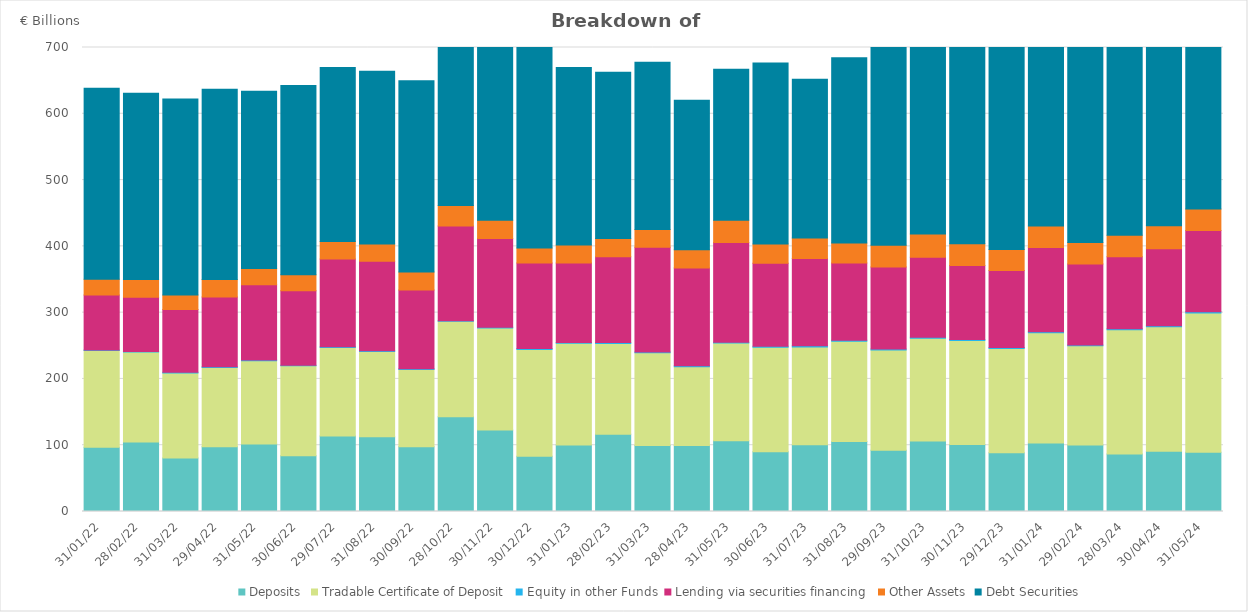
| Category | Deposits | Tradable Certificate of Deposit | Equity in other Funds | Lending via securities financing  | Other Assets | Debt Securities |
|---|---|---|---|---|---|---|
| 2022-01-31 | 96.931 | 145.783 | 0.951 | 82.998 | 23.782 | 288.022 |
| 2022-02-28 | 104.979 | 135.542 | 0.958 | 81.764 | 26.849 | 280.936 |
| 2022-03-31 | 80.633 | 128.457 | 0.891 | 94.76 | 22.064 | 295.665 |
| 2022-04-29 | 97.612 | 119.74 | 0.967 | 105.41 | 26.41 | 286.718 |
| 2022-05-31 | 101.959 | 125.629 | 0.978 | 113.582 | 24.392 | 267.425 |
| 2022-06-30 | 84.23 | 135.586 | 0.878 | 112.255 | 24.147 | 285.732 |
| 2022-07-29 | 113.998 | 133.584 | 0.941 | 132.268 | 26.511 | 262.645 |
| 2022-08-31 | 112.946 | 128.389 | 1.121 | 135.04 | 26.093 | 260.702 |
| 2022-09-30 | 97.817 | 116.577 | 0.971 | 118.666 | 27.367 | 288.49 |
| 2022-10-28 | 143.019 | 143.832 | 1.017 | 142.983 | 30.956 | 297.944 |
| 2022-11-30 | 122.764 | 154.139 | 1.043 | 134.023 | 27.581 | 304.953 |
| 2022-12-30 | 83.366 | 161.193 | 1.222 | 128.925 | 22.665 | 302.782 |
| 2023-01-31 | 100.171 | 153.568 | 1.288 | 119.974 | 26.982 | 267.843 |
| 2023-02-28 | 116.596 | 136.961 | 1.342 | 129.497 | 27.521 | 250.886 |
| 2023-03-31 | 99.51 | 139.93 | 1.221 | 157.945 | 26.846 | 252.237 |
| 2023-04-28 | 99.71 | 118.618 | 1.482 | 147.59 | 27.376 | 225.646 |
| 2023-05-31 | 106.898 | 147.175 | 1.3 | 150.427 | 33.691 | 227.549 |
| 2023-06-30 | 90.308 | 157.571 | 1.429 | 125.268 | 28.982 | 272.938 |
| 2023-07-31 | 100.666 | 147.634 | 1.692 | 131.514 | 30.945 | 239.728 |
| 2023-08-31 | 105.467 | 151.48 | 1.518 | 116.315 | 30.197 | 279.502 |
| 2023-09-29 | 92.274 | 151.375 | 1.604 | 123.79 | 32.715 | 300.374 |
| 2023-10-31 | 106.234 | 154.997 | 1.521 | 120.907 | 35.008 | 286.899 |
| 2023-11-30 | 101.01 | 156.797 | 1.543 | 111.625 | 33.007 | 331.991 |
| 2023-12-29 | 88.472 | 157.546 | 1.451 | 116.062 | 31.579 | 341.16 |
| 2024-01-31 | 103.444 | 166.403 | 1.455 | 127.158 | 32.38 | 326.412 |
| 2024-02-29 | 100.393 | 149.493 | 1.474 | 122.056 | 32.376 | 313.497 |
| 2024-03-28 | 86.618 | 187.761 | 1.466 | 108.64 | 32.29 | 324.334 |
| 2024-04-30 | 91.075 | 187.624 | 1.414 | 116.337 | 34.811 | 302.541 |
| 2024-05-31 | 89.403 | 210.188 | 1.667 | 122.545 | 32.515 | 301.623 |